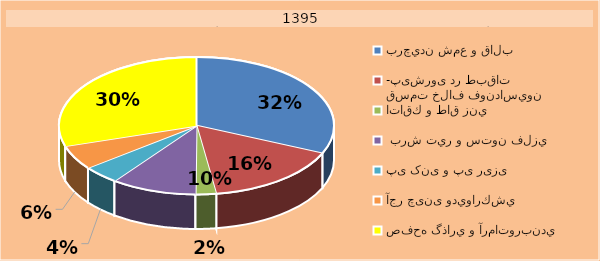
| Category | Series 0 |
|---|---|
| برچيدن شمع و قالب | 900 |
| قسمت خلاف فونداسيون -پیشروی در طبقات  | 458 |
| اتاقك و طاق زني | 68 |
|  برش تير و ستون فلزي | 286 |
| پی کنی و پی ریزی | 123 |
| آجر چینی وديواركشي  | 163 |
| صفحه گذاري و آرماتوربندي | 848 |